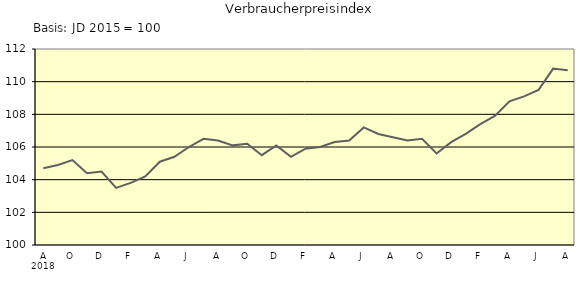
| Category | Series 0 |
|---|---|
| 0 | 104.7 |
| 1 | 104.9 |
| 2 | 105.2 |
| 3 | 104.4 |
| 4 | 104.5 |
| 5 | 103.5 |
| 6 | 103.8 |
| 7 | 104.2 |
| 8 | 105.1 |
| 9 | 105.4 |
| 10 | 106 |
| 11 | 106.5 |
| 12 | 106.4 |
| 13 | 106.1 |
| 14 | 106.2 |
| 15 | 105.5 |
| 16 | 106.1 |
| 17 | 105.4 |
| 18 | 105.9 |
| 19 | 106 |
| 20 | 106.3 |
| 21 | 106.4 |
| 22 | 107.2 |
| 23 | 106.8 |
| 24 | 106.6 |
| 25 | 106.4 |
| 26 | 106.5 |
| 27 | 105.6 |
| 28 | 106.3 |
| 29 | 106.8 |
| 30 | 107.4 |
| 31 | 107.9 |
| 32 | 108.8 |
| 33 | 109.1 |
| 34 | 109.5 |
| 35 | 110.8 |
| 36 | 110.7 |